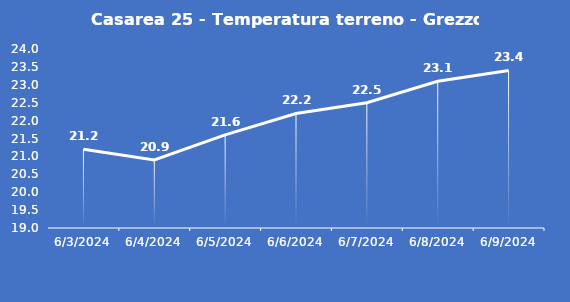
| Category | Casarea 25 - Temperatura terreno - Grezzo (°C) |
|---|---|
| 6/3/24 | 21.2 |
| 6/4/24 | 20.9 |
| 6/5/24 | 21.6 |
| 6/6/24 | 22.2 |
| 6/7/24 | 22.5 |
| 6/8/24 | 23.1 |
| 6/9/24 | 23.4 |